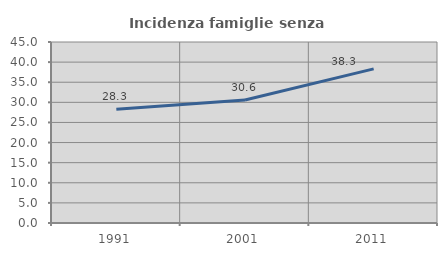
| Category | Incidenza famiglie senza nuclei |
|---|---|
| 1991.0 | 28.275 |
| 2001.0 | 30.593 |
| 2011.0 | 38.318 |